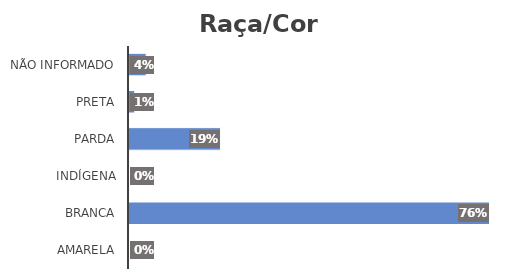
| Category | Series 0 |
|---|---|
| Amarela | 0 |
| Branca | 0.759 |
| Indígena | 0 |
| Parda | 0.193 |
| Preta | 0.012 |
| Não Informado | 0.036 |